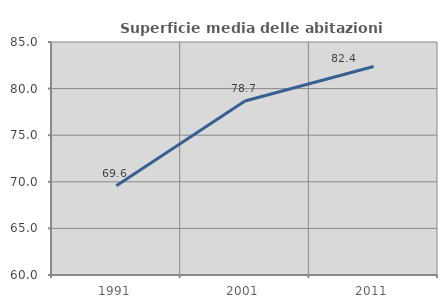
| Category | Superficie media delle abitazioni occupate |
|---|---|
| 1991.0 | 69.566 |
| 2001.0 | 78.676 |
| 2011.0 | 82.366 |